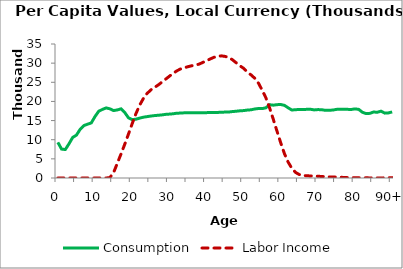
| Category | Consumption | Labor Income |
|---|---|---|
| 0 | 9309.489 | 0 |
|  | 7551.084 | 0 |
| 2 | 7433.948 | 0 |
| 3 | 8935.244 | 0 |
| 4 | 10604.104 | 0 |
| 5 | 11195.634 | 0 |
| 6 | 12711.497 | 0 |
| 7 | 13698.281 | 0 |
| 8 | 14050.319 | 0 |
| 9 | 14390.763 | 0 |
| 10 | 16049.382 | 0 |
| 11 | 17433.019 | 0 |
| 12 | 17914.826 | 0.157 |
| 13 | 18305.436 | 0 |
| 14 | 18068.741 | 110.387 |
| 15 | 17618.244 | 1398.699 |
| 16 | 17772.704 | 3831.249 |
| 17 | 18064.608 | 6263.8 |
| 18 | 17123.834 | 8796.262 |
| 19 | 15737.463 | 11445.398 |
| 20 | 15251.048 | 14165.315 |
| 21 | 15349.302 | 16753.597 |
| 22 | 15630.68 | 18982.373 |
| 23 | 15876.109 | 20728.135 |
| 24 | 16027.887 | 22046.834 |
| 25 | 16174.252 | 22990.716 |
| 26 | 16297.6 | 23653.072 |
| 27 | 16387.501 | 24279.525 |
| 28 | 16474.819 | 25033.974 |
| 29 | 16616.358 | 25801.794 |
| 30 | 16689.58 | 26558.539 |
| 31 | 16768.403 | 27296.177 |
| 32 | 16923.67 | 27970.879 |
| 33 | 16955.573 | 28468.613 |
| 34 | 17019.82 | 28783.329 |
| 35 | 17010.378 | 29066.568 |
| 36 | 17047.298 | 29306.039 |
| 37 | 17035.975 | 29493.396 |
| 38 | 17050.192 | 29737.294 |
| 39 | 17060.325 | 30177.193 |
| 40 | 17070.599 | 30613.636 |
| 41 | 17099.79 | 31079.705 |
| 42 | 17128.358 | 31513.787 |
| 43 | 17123.972 | 31810.977 |
| 44 | 17180.863 | 31904.984 |
| 45 | 17216.068 | 31760.45 |
| 46 | 17234.793 | 31497.42 |
| 47 | 17354.752 | 30885.964 |
| 48 | 17435.96 | 30103.849 |
| 49 | 17544.493 | 29309.989 |
| 50 | 17607.949 | 28659.368 |
| 51 | 17743.405 | 27686.114 |
| 52 | 17812.21 | 26934.49 |
| 53 | 18024.405 | 26066.364 |
| 54 | 18147.929 | 24799.167 |
| 55 | 18124.899 | 22948.889 |
| 56 | 18329.427 | 20968.008 |
| 57 | 19137.786 | 18312.111 |
| 58 | 19023.799 | 15336.271 |
| 59 | 19155.705 | 12228.755 |
| 60 | 19197.034 | 9210.324 |
| 61 | 18975.13 | 6355.294 |
| 62 | 18335.632 | 4159.093 |
| 63 | 17755.416 | 2518.288 |
| 64 | 17840.93 | 1448.612 |
| 65 | 17896.684 | 904.195 |
| 66 | 17901.372 | 686.775 |
| 67 | 17929.299 | 578.175 |
| 68 | 17953.891 | 538.321 |
| 69 | 17784.943 | 514.693 |
| 70 | 17867.441 | 450.14 |
| 71 | 17835.843 | 406.298 |
| 72 | 17683.061 | 340.681 |
| 73 | 17726.245 | 291.138 |
| 74 | 17728.761 | 253.839 |
| 75 | 17920.482 | 241.927 |
| 76 | 17979.256 | 185.332 |
| 77 | 17933.335 | 150.825 |
| 78 | 17929.5 | 115.799 |
| 79 | 17899.839 | 82.853 |
| 80 | 18052.52 | 49.904 |
| 81 | 17925.502 | 44.287 |
| 82 | 17168.001 | 39.255 |
| 83 | 16819.721 | 36.935 |
| 84 | 16885.899 | 28.905 |
| 85 | 17233.115 | 20.48 |
| 86 | 17173.555 | 18.92 |
| 87 | 17453.571 | 24.734 |
| 88 | 16945.803 | 38.427 |
| 89 | 17004.557 | 62.403 |
| 90+ | 17262.116 | 86.38 |